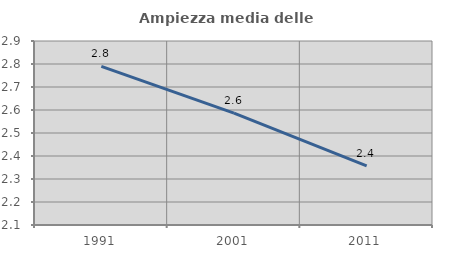
| Category | Ampiezza media delle famiglie |
|---|---|
| 1991.0 | 2.79 |
| 2001.0 | 2.586 |
| 2011.0 | 2.357 |